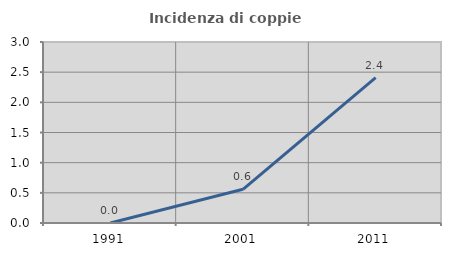
| Category | Incidenza di coppie miste |
|---|---|
| 1991.0 | 0 |
| 2001.0 | 0.559 |
| 2011.0 | 2.41 |